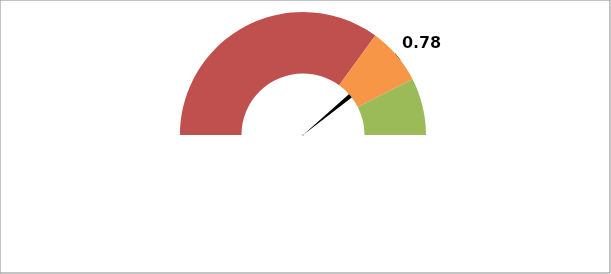
| Category | Series 1 |
|---|---|
| 0 | 180 |
| 1 | 138.4 |
| 2 | 4 |
| 3 | 37.6 |